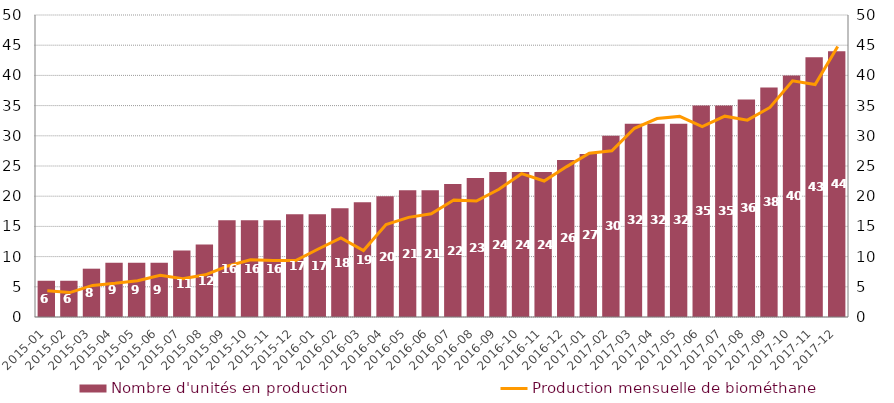
| Category | Nombre d'unités en production |
|---|---|
| 2015-01 | 6 |
| 2015-02 | 6 |
| 2015-03 | 8 |
| 2015-04 | 9 |
| 2015-05 | 9 |
| 2015-06 | 9 |
| 2015-07 | 11 |
| 2015-08 | 12 |
| 2015-09 | 16 |
| 2015-10 | 16 |
| 2015-11 | 16 |
| 2015-12 | 17 |
| 2016-01 | 17 |
| 2016-02 | 18 |
| 2016-03 | 19 |
| 2016-04 | 20 |
| 2016-05 | 21 |
| 2016-06 | 21 |
| 2016-07 | 22 |
| 2016-08 | 23 |
| 2016-09 | 24 |
| 2016-10 | 24 |
| 2016-11 | 24 |
| 2016-12 | 26 |
| 2017-01 | 27 |
| 2017-02 | 30 |
| 2017-03 | 32 |
| 2017-04 | 32 |
| 2017-05 | 32 |
| 2017-06 | 35 |
| 2017-07 | 35 |
| 2017-08 | 36 |
| 2017-09 | 38 |
| 2017-10 | 40 |
| 2017-11 | 43 |
| 2017-12 | 44 |